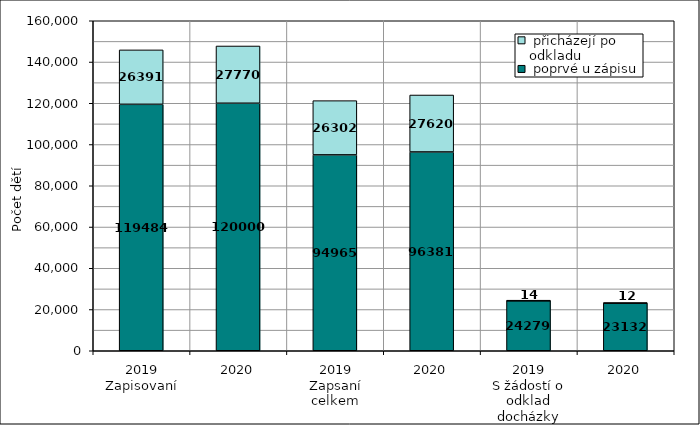
| Category |  poprvé u zápisu |  přicházejí po odkladu |
|---|---|---|
| 0 | 119484 | 26391 |
| 1 | 120000 | 27770 |
| 2 | 94965 | 26302 |
| 3 | 96381 | 27620 |
| 4 | 24279 | 14 |
| 5 | 23132 | 12 |